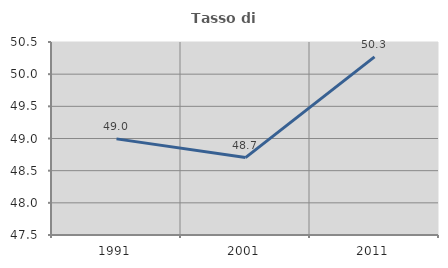
| Category | Tasso di occupazione   |
|---|---|
| 1991.0 | 48.994 |
| 2001.0 | 48.704 |
| 2011.0 | 50.269 |